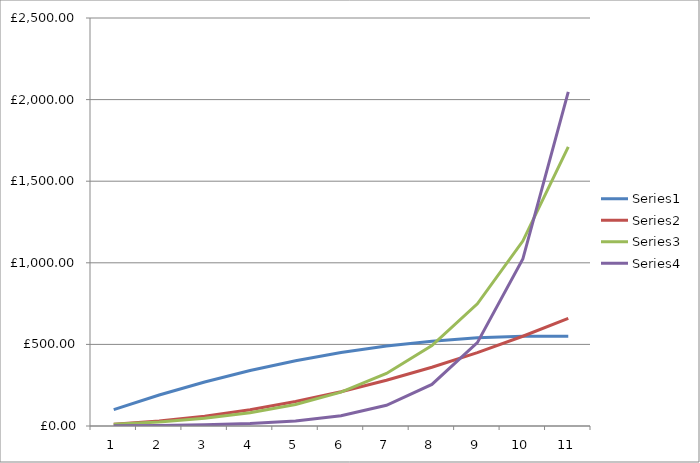
| Category | Series 0 | Series 1 | Series 2 | Series 3 |
|---|---|---|---|---|
| 0 | 100 | 10 | 10 | 1 |
| 1 | 190 | 30 | 25 | 3 |
| 2 | 270 | 60 | 47.5 | 7 |
| 3 | 340 | 100 | 81.25 | 15 |
| 4 | 400 | 150 | 131.875 | 31 |
| 5 | 450 | 210 | 207.812 | 63 |
| 6 | 490 | 280 | 321.719 | 127 |
| 7 | 520 | 360 | 492.578 | 255 |
| 8 | 540 | 450 | 748.867 | 511 |
| 9 | 550 | 550 | 1133.301 | 1023 |
| 10 | 550 | 660 | 1709.951 | 2047 |